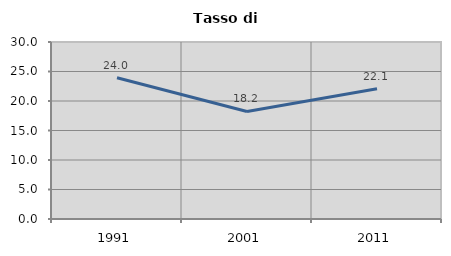
| Category | Tasso di disoccupazione   |
|---|---|
| 1991.0 | 23.951 |
| 2001.0 | 18.226 |
| 2011.0 | 22.089 |